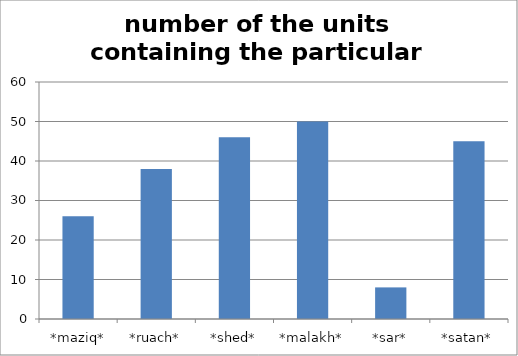
| Category | Series 0 |
|---|---|
| *maziq* | 26 |
| *ruach* | 38 |
| *shed* | 46 |
| *malakh* | 50 |
| *sar* | 8 |
| *satan* | 45 |